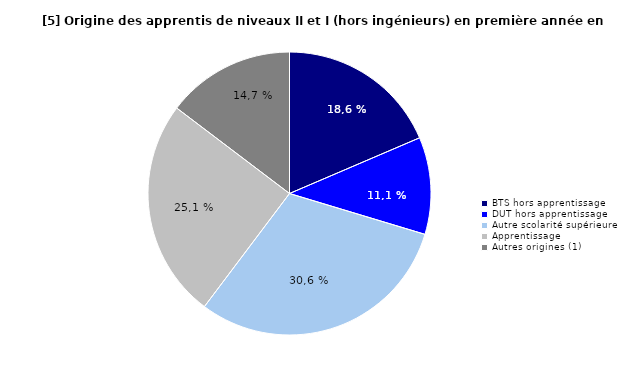
| Category | Series 0 | Series 1 |
|---|---|---|
| BTS hors apprentissage | 18.56 |  |
| DUT hors apprentissage | 11.1 |  |
| Autre scolarité supérieure | 30.6 |  |
| Apprentissage | 25.05 |  |
| Autres origines (1) | 14.68 |  |